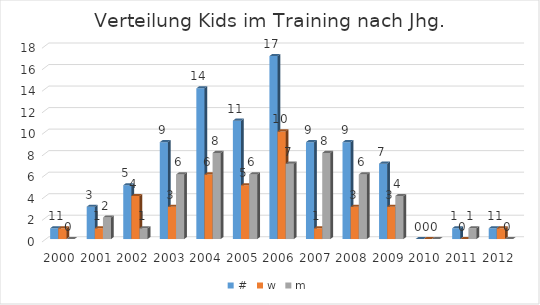
| Category | # | w | m |
|---|---|---|---|
| 2000.0 | 1 | 1 | 0 |
| 2001.0 | 3 | 1 | 2 |
| 2002.0 | 5 | 4 | 1 |
| 2003.0 | 9 | 3 | 6 |
| 2004.0 | 14 | 6 | 8 |
| 2005.0 | 11 | 5 | 6 |
| 2006.0 | 17 | 10 | 7 |
| 2007.0 | 9 | 1 | 8 |
| 2008.0 | 9 | 3 | 6 |
| 2009.0 | 7 | 3 | 4 |
| 2010.0 | 0 | 0 | 0 |
| 2011.0 | 1 | 0 | 1 |
| 2012.0 | 1 | 1 | 0 |